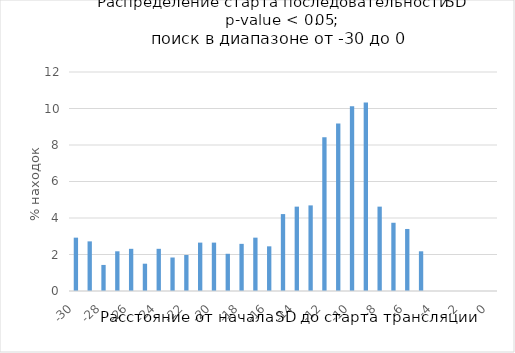
| Category | Series 0 |
|---|---|
| -30.0 | 2.923 |
| -29.0 | 2.719 |
| -28.0 | 1.428 |
| -27.0 | 2.175 |
| -26.0 | 2.311 |
| -25.0 | 1.496 |
| -24.0 | 2.311 |
| -23.0 | 1.835 |
| -22.0 | 1.971 |
| -21.0 | 2.651 |
| -20.0 | 2.651 |
| -19.0 | 2.039 |
| -18.0 | 2.583 |
| -17.0 | 2.923 |
| -16.0 | 2.447 |
| -15.0 | 4.215 |
| -14.0 | 4.623 |
| -13.0 | 4.691 |
| -12.0 | 8.43 |
| -11.0 | 9.177 |
| -10.0 | 10.129 |
| -9.0 | 10.333 |
| -8.0 | 4.623 |
| -7.0 | 3.739 |
| -6.0 | 3.399 |
| -5.0 | 2.175 |
| -4.0 | 0 |
| -3.0 | 0 |
| -2.0 | 0 |
| -1.0 | 0 |
| 0.0 | 0 |